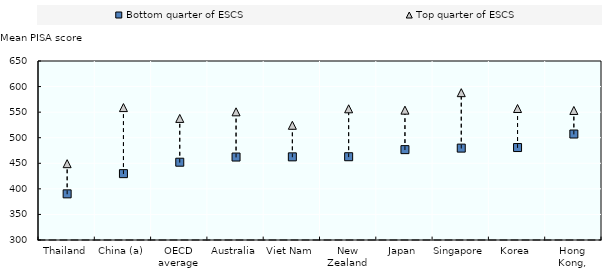
| Category | Bottom quarter of ESCS | Top quarter of ESCS |
|---|---|---|
| Thailand | 390.221 | 449.219 |
| China (a) | 429.735 | 558.921 |
| OECD average | 452.094 | 537.727 |
| Australia | 462.224 | 550.587 |
| Viet Nam | 462.58 | 524.303 |
| New Zealand | 462.823 | 556.541 |
| Japan | 476.694 | 553.885 |
| Singapore | 479.659 | 588.087 |
| Korea | 480.786 | 557.073 |
| Hong Kong, China | 507.218 | 553.294 |